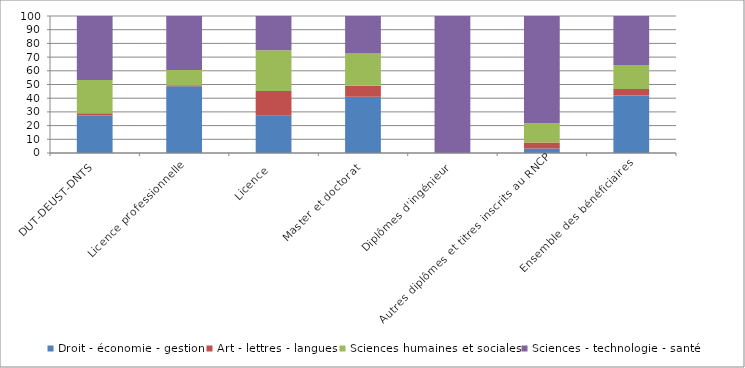
| Category | Droit - économie - gestion | Art - lettres - langues | Sciences humaines et sociales | Sciences - technologie - santé |
|---|---|---|---|---|
| DUT-DEUST-DNTS | 27.4 | 1.6 | 24.2 | 46.8 |
| Licence professionnelle | 48.7 | 0.7 | 11.2 | 39.4 |
| Licence  | 27.2 | 18 | 29.8 | 25 |
| Master et doctorat  | 41 | 8.1 | 23.6 | 27.3 |
| Diplômes d'ingénieur  | 0 | 0 | 0 | 100 |
| Autres diplômes et titres inscrits au RNCP | 3.3 | 4.3 | 14.1 | 78.3 |
| Ensemble des bénéficiaires  | 41.9 | 4.9 | 17.5 | 35.7 |